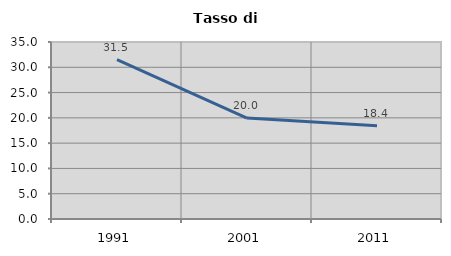
| Category | Tasso di disoccupazione   |
|---|---|
| 1991.0 | 31.513 |
| 2001.0 | 19.957 |
| 2011.0 | 18.449 |